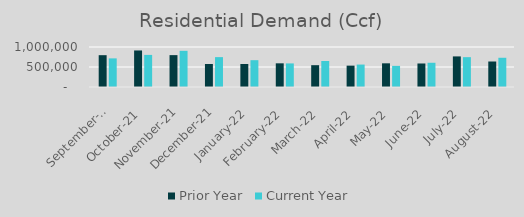
| Category | Prior Year | Current Year |
|---|---|---|
| 2021-09-01 | 795392.365 | 715703.433 |
| 2021-10-01 | 913450.318 | 802383.882 |
| 2021-11-01 | 796803.85 | 904247.352 |
| 2021-12-01 | 575698.992 | 746791.488 |
| 2022-01-01 | 574964.407 | 670556.394 |
| 2022-02-01 | 591912.627 | 589693.822 |
| 2022-03-01 | 545392.69 | 650741.307 |
| 2022-04-01 | 533967.423 | 560920.541 |
| 2022-05-01 | 591911.753 | 528033 |
| 2022-06-01 | 587861.265 | 605957.158 |
| 2022-07-01 | 764849.567 | 746133 |
| 2022-08-01 | 637451.79 | 730870.571 |